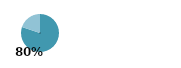
| Category | Series 0 |
|---|---|
| 0 | 0.801 |
| 1 | 0.199 |